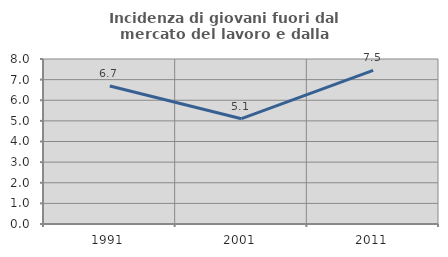
| Category | Incidenza di giovani fuori dal mercato del lavoro e dalla formazione  |
|---|---|
| 1991.0 | 6.689 |
| 2001.0 | 5.105 |
| 2011.0 | 7.451 |